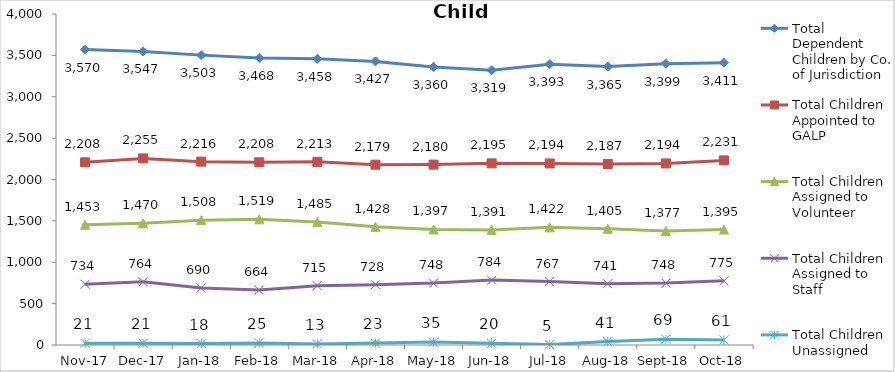
| Category | Total Dependent Children by Co. of Jurisdiction | Total Children Appointed to GALP | Total Children Assigned to Volunteer | Total Children Assigned to Staff | Total Children Unassigned |
|---|---|---|---|---|---|
| 2017-11-01 | 3570 | 2208 | 1453 | 734 | 21 |
| 2017-12-01 | 3547 | 2255 | 1470 | 764 | 21 |
| 2018-01-01 | 3503 | 2216 | 1508 | 690 | 18 |
| 2018-02-01 | 3468 | 2208 | 1519 | 664 | 25 |
| 2018-03-01 | 3458 | 2213 | 1485 | 715 | 13 |
| 2018-04-01 | 3427 | 2179 | 1428 | 728 | 23 |
| 2018-05-01 | 3360 | 2180 | 1397 | 748 | 35 |
| 2018-06-01 | 3319 | 2195 | 1391 | 784 | 20 |
| 2018-07-01 | 3393 | 2194 | 1422 | 767 | 5 |
| 2018-08-01 | 3365 | 2187 | 1405 | 741 | 41 |
| 2018-09-01 | 3399 | 2194 | 1377 | 748 | 69 |
| 2018-10-01 | 3411 | 2231 | 1395 | 775 | 61 |